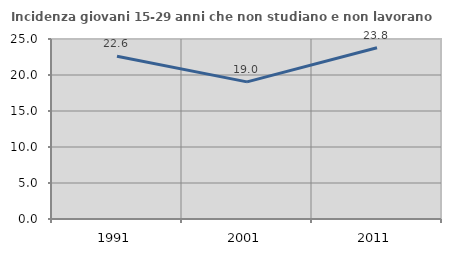
| Category | Incidenza giovani 15-29 anni che non studiano e non lavorano  |
|---|---|
| 1991.0 | 22.599 |
| 2001.0 | 19.048 |
| 2011.0 | 23.776 |